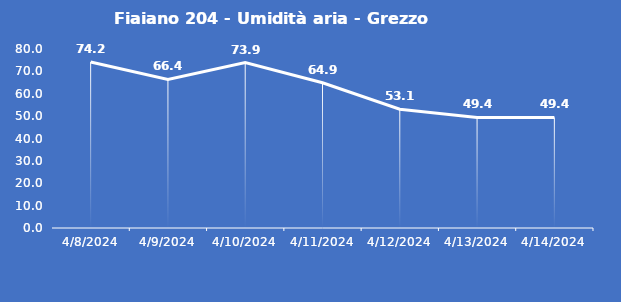
| Category | Fiaiano 204 - Umidità aria - Grezzo (%) |
|---|---|
| 4/8/24 | 74.2 |
| 4/9/24 | 66.4 |
| 4/10/24 | 73.9 |
| 4/11/24 | 64.9 |
| 4/12/24 | 53.1 |
| 4/13/24 | 49.4 |
| 4/14/24 | 49.4 |